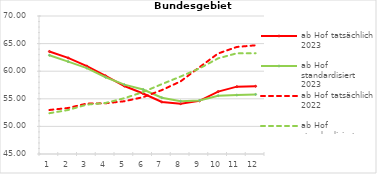
| Category | ab Hof tatsächlich 2023 | ab Hof standardisiert 2023 | ab Hof tatsächlich 2022 | ab Hof standardisiert 2022 |
|---|---|---|---|---|
| 0 | 63.572 | 62.884 | 52.975 | 52.386 |
| 1 | 62.409 | 61.741 | 53.339 | 52.971 |
| 2 | 60.92 | 60.56 | 54.141 | 53.95 |
| 3 | 59.157 | 58.909 | 54.188 | 54.25 |
| 4 | 57.317 | 57.56 | 54.558 | 55.11 |
| 5 | 55.961 | 56.685 | 55.295 | 56.229 |
| 6 | 54.423 | 55.2 | 56.582 | 57.663 |
| 7 | 54.119 | 54.576 | 58.16 | 59.037 |
| 8 | 54.625 | 54.691 | 60.707 | 60.495 |
| 9 | 56.305 | 55.557 | 63.211 | 62.327 |
| 10 | 57.201 | 55.679 | 64.393 | 63.246 |
| 11 | 57.27 | 55.792 | 64.694 | 63.245 |